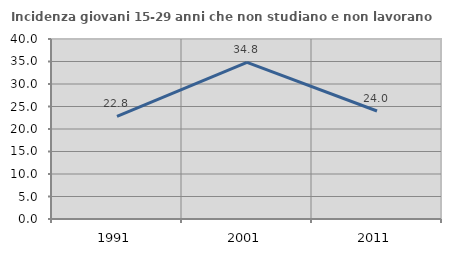
| Category | Incidenza giovani 15-29 anni che non studiano e non lavorano  |
|---|---|
| 1991.0 | 22.794 |
| 2001.0 | 34.799 |
| 2011.0 | 24.005 |